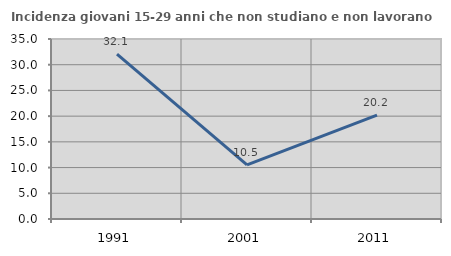
| Category | Incidenza giovani 15-29 anni che non studiano e non lavorano  |
|---|---|
| 1991.0 | 32.075 |
| 2001.0 | 10.526 |
| 2011.0 | 20.188 |